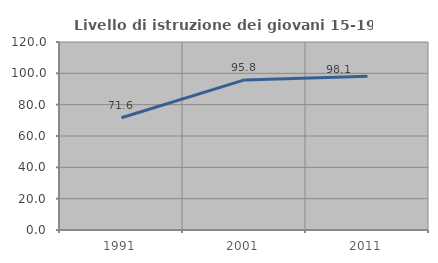
| Category | Livello di istruzione dei giovani 15-19 anni |
|---|---|
| 1991.0 | 71.627 |
| 2001.0 | 95.793 |
| 2011.0 | 98.077 |